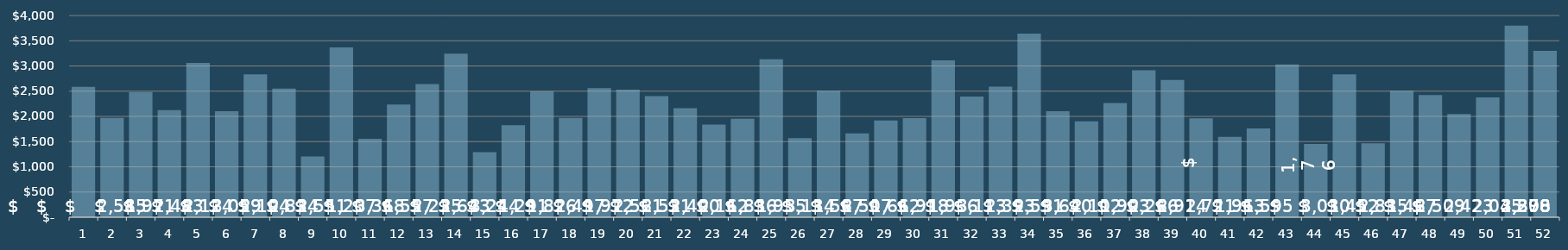
| Category | Revenue Per Acquisition |
|---|---|
| 1.0 | 2584.579 |
| 2.0 | 1971.35 |
| 3.0 | 2483.316 |
| 4.0 | 2124.286 |
| 5.0 | 3058.867 |
| 6.0 | 2103.773 |
| 7.0 | 2834.118 |
| 8.0 | 2551.308 |
| 9.0 | 1207.091 |
| 10.0 | 3368.176 |
| 11.0 | 1557.368 |
| 12.0 | 2235.429 |
| 13.0 | 2643.062 |
| 14.0 | 3243.647 |
| 15.0 | 1290.864 |
| 16.0 | 1826.389 |
| 17.0 | 2497 |
| 18.0 | 1971.526 |
| 19.0 | 2560.769 |
| 20.0 | 2530.6 |
| 21.0 | 2399.789 |
| 22.0 | 2162 |
| 23.0 | 1835.524 |
| 24.0 | 1954.857 |
| 25.0 | 3134.385 |
| 26.0 | 1567.4 |
| 27.0 | 2507.125 |
| 28.0 | 1662 |
| 29.0 | 1917.875 |
| 30.0 | 1966.15 |
| 31.0 | 3112.533 |
| 32.0 | 2393.136 |
| 33.0 | 2590.765 |
| 34.0 | 3640 |
| 35.0 | 2101.727 |
| 36.0 | 1903.412 |
| 37.0 | 2266.316 |
| 38.0 | 2913.714 |
| 39.0 | 2721 |
| 40.0 | 1963.294 |
| 41.0 | 1594.864 |
| 42.0 | 1760.556 |
| 43.0 | 3029.529 |
| 44.0 | 1452 |
| 45.0 | 2835.077 |
| 46.0 | 1467.15 |
| 47.0 | 2509.316 |
| 48.0 | 2423.05 |
| 49.0 | 2044.905 |
| 50.0 | 2378.095 |
| 51.0 | 3799.769 |
| 52.0 | 3297.529 |